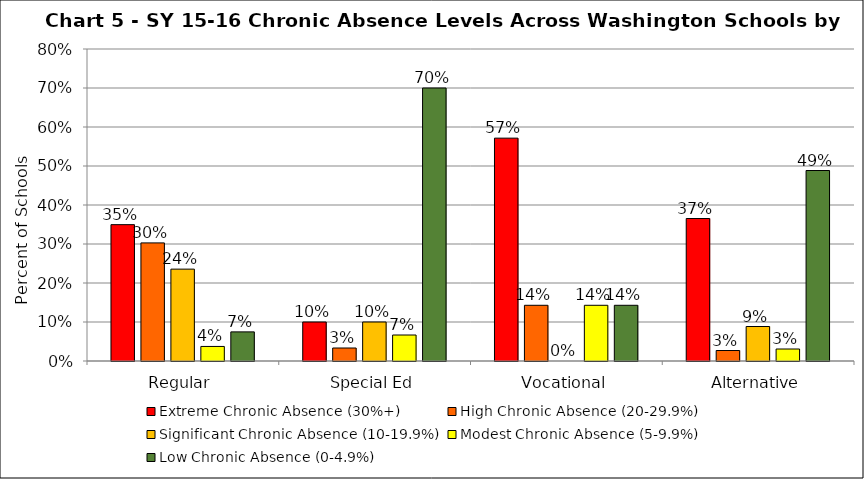
| Category | Extreme Chronic Absence (30%+) | High Chronic Absence (20-29.9%) | Significant Chronic Absence (10-19.9%) | Modest Chronic Absence (5-9.9%) | Low Chronic Absence (0-4.9%) |
|---|---|---|---|---|---|
| 0 | 0.35 | 0.303 | 0.236 | 0.037 | 0.075 |
| 1 | 0.1 | 0.033 | 0.1 | 0.067 | 0.7 |
| 2 | 0.571 | 0.143 | 0 | 0.143 | 0.143 |
| 3 | 0.365 | 0.027 | 0.088 | 0.031 | 0.488 |